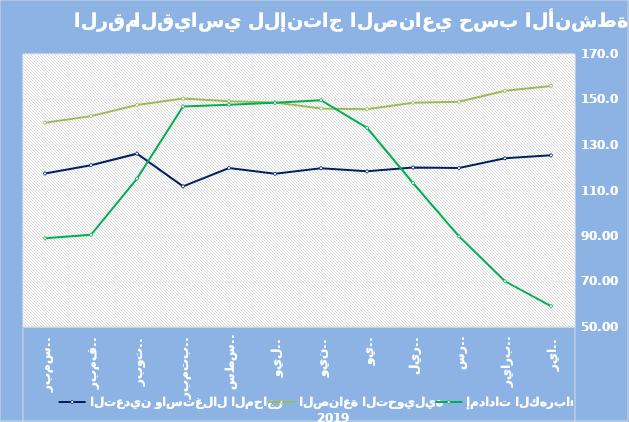
| Category | التعدين واستغلال المحاجر | الصناعة التحويلية | إمدادات الكهرباء |
|---|---|---|---|
| 0 | 125.45 | 155.98 | 59.15 |
| 1 | 124.14 | 153.87 | 70.1 |
| 2 | 119.87 | 148.98 | 89.82 |
| 3 | 120.11 | 148.54 | 113.29 |
| 4 | 118.43 | 145.76 | 137.57 |
| 5 | 119.81 | 146.05 | 149.7 |
| 6 | 117.33 | 148.68 | 148.56 |
| 7 | 119.89 | 149.23 | 147.74 |
| 8 | 111.81 | 150.42 | 146.92 |
| 9 | 126.188 | 147.61 | 115.237 |
| 10 | 121.13 | 142.69 | 90.54 |
| 11 | 117.5 | 139.83 | 88.97 |